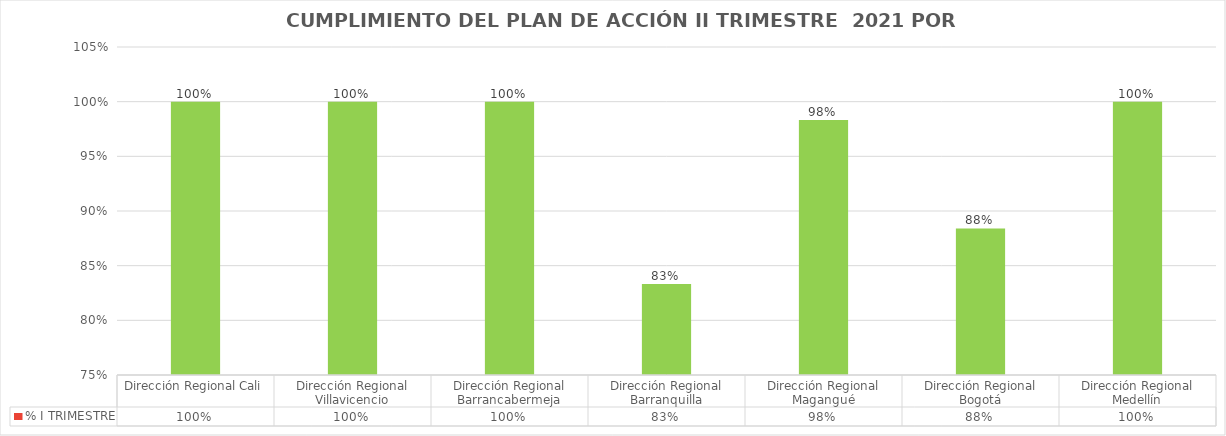
| Category | % I TRIMESTRE |
|---|---|
| Dirección Regional Cali | 1 |
| Dirección Regional Villavicencio | 1 |
| Dirección Regional Barrancabermeja | 1 |
| Dirección Regional Barranquilla | 0.833 |
| Dirección Regional Magangué | 0.983 |
| Dirección Regional Bogotá | 0.884 |
| Dirección Regional Medellín | 1 |